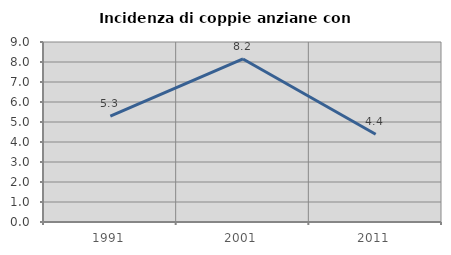
| Category | Incidenza di coppie anziane con figli |
|---|---|
| 1991.0 | 5.29 |
| 2001.0 | 8.152 |
| 2011.0 | 4.389 |